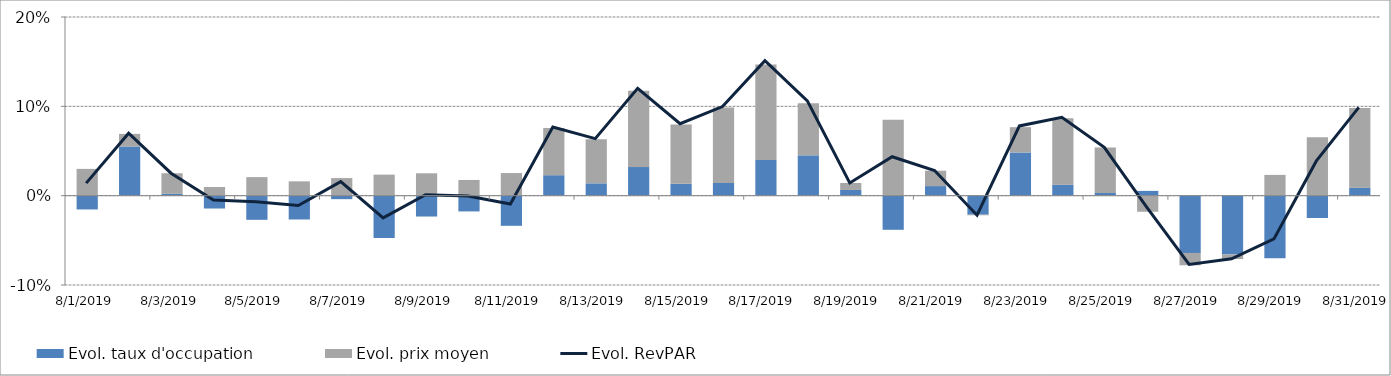
| Category | Evol. taux d'occupation | Evol. prix moyen |
|---|---|---|
| 8/1/19 | -0.015 | 0.03 |
| 8/2/19 | 0.055 | 0.014 |
| 8/3/19 | 0.002 | 0.023 |
| 8/4/19 | -0.014 | 0.01 |
| 8/5/19 | -0.027 | 0.021 |
| 8/6/19 | -0.027 | 0.016 |
| 8/7/19 | -0.004 | 0.02 |
| 8/8/19 | -0.047 | 0.024 |
| 8/9/19 | -0.023 | 0.025 |
| 8/10/19 | -0.018 | 0.018 |
| 8/11/19 | -0.034 | 0.025 |
| 8/12/19 | 0.023 | 0.053 |
| 8/13/19 | 0.014 | 0.049 |
| 8/14/19 | 0.032 | 0.085 |
| 8/15/19 | 0.013 | 0.066 |
| 8/16/19 | 0.014 | 0.084 |
| 8/17/19 | 0.04 | 0.107 |
| 8/18/19 | 0.045 | 0.058 |
| 8/19/19 | 0.006 | 0.008 |
| 8/20/19 | -0.038 | 0.085 |
| 8/21/19 | 0.011 | 0.017 |
| 8/22/19 | -0.021 | -0.001 |
| 8/23/19 | 0.048 | 0.028 |
| 8/24/19 | 0.012 | 0.074 |
| 8/25/19 | 0.003 | 0.051 |
| 8/26/19 | 0.005 | -0.018 |
| 8/27/19 | -0.064 | -0.014 |
| 8/28/19 | -0.066 | -0.005 |
| 8/29/19 | -0.07 | 0.023 |
| 8/30/19 | -0.025 | 0.065 |
| 8/31/19 | 0.009 | 0.089 |